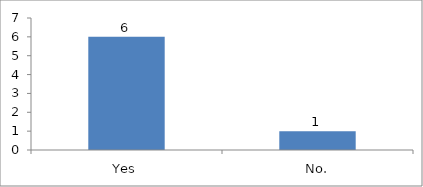
| Category | Was the time allocated for the session sufficient? |
|---|---|
| Yes | 6 |
| No. | 1 |